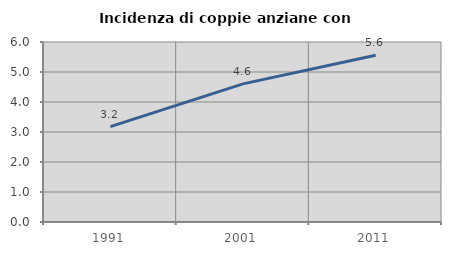
| Category | Incidenza di coppie anziane con figli |
|---|---|
| 1991.0 | 3.178 |
| 2001.0 | 4.605 |
| 2011.0 | 5.56 |